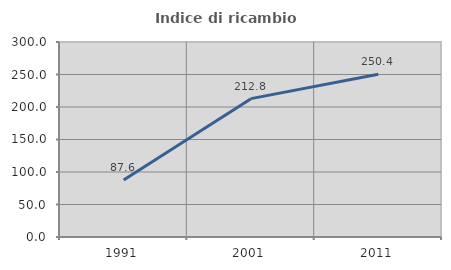
| Category | Indice di ricambio occupazionale  |
|---|---|
| 1991.0 | 87.647 |
| 2001.0 | 212.844 |
| 2011.0 | 250.435 |